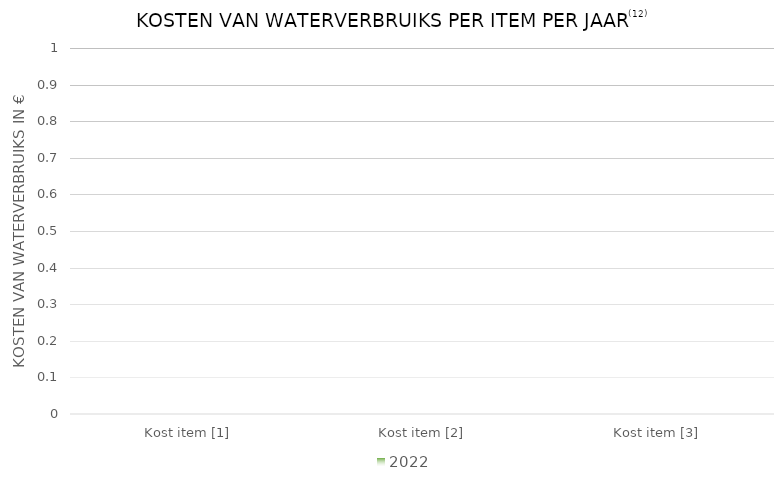
| Category | 2022 |
|---|---|
|  Kost item [1] | 0 |
|  Kost item [2] | 0 |
|  Kost item [3] | 0 |